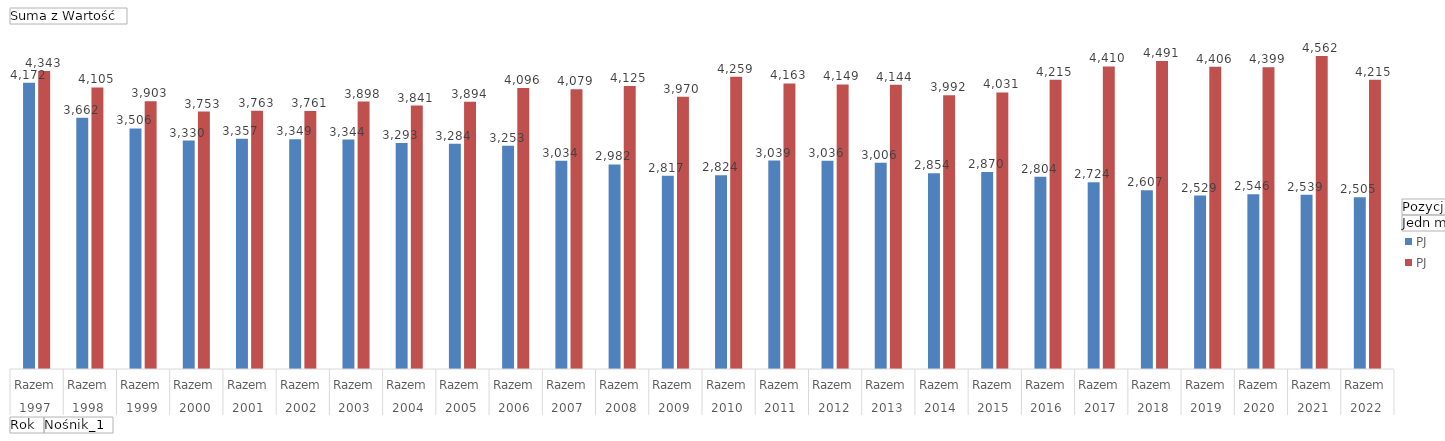
| Category | Pozyskanie - PJ | Zużycie krajowe - PJ |
|---|---|---|
| 0 | 4172 | 4343 |
| 1 | 3662 | 4104.6 |
| 2 | 3506 | 3903 |
| 3 | 3330 | 3753 |
| 4 | 3357 | 3763 |
| 5 | 3349 | 3761 |
| 6 | 3344 | 3898 |
| 7 | 3293 | 3841 |
| 8 | 3284 | 3894 |
| 9 | 3253 | 4096 |
| 10 | 3034 | 4079 |
| 11 | 2982 | 4125 |
| 12 | 2817 | 3970 |
| 13 | 2824 | 4259 |
| 14 | 3039 | 4163 |
| 15 | 3036 | 4149 |
| 16 | 3006 | 4144 |
| 17 | 2854 | 3992 |
| 18 | 2870 | 4031 |
| 19 | 2804 | 4215 |
| 20 | 2724 | 4410 |
| 21 | 2607 | 4491 |
| 22 | 2529 | 4406 |
| 23 | 2546 | 4399 |
| 24 | 2539 | 4562 |
| 25 | 2505 | 4215 |